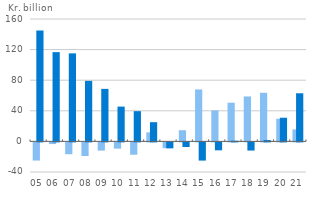
| Category | With instalments | Without instalments |
|---|---|---|
| 05 | -23.72 | 144.973 |
| 06 | -2.18 | 116.681 |
| 07 | -15.471 | 115.087 |
| 08 | -17.796 | 79.166 |
| 09 | -10.732 | 68.672 |
| 10 | -8.166 | 45.508 |
| 11 | -16.12 | 39.553 |
| 12 | 11.826 | 25.12 |
| 13 | -7.548 | -7.751 |
| 14 | 14.604 | -6.032 |
| 15 | 67.927 | -23.769 |
| 16 | 40.578 | -10.343 |
| 17 | 50.594 | 0.907 |
| 18 | 58.753 | -10.65 |
| 19 | 63.553 | 1.777 |
| 20 | 29.577 | 30.925 |
| 21 | 15.631 | 62.924 |